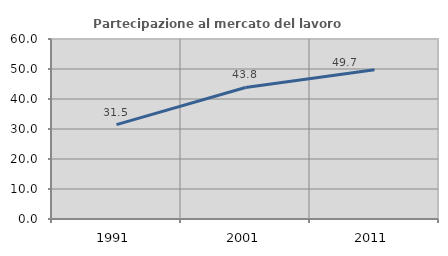
| Category | Partecipazione al mercato del lavoro  femminile |
|---|---|
| 1991.0 | 31.469 |
| 2001.0 | 43.838 |
| 2011.0 | 49.749 |